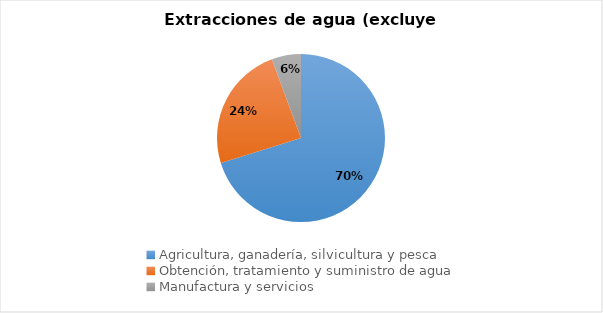
| Category | Series 1 | Series 0 |
|---|---|---|
| Agricultura, ganadería, silvicultura y pesca | 1731.022 | 1731.022 |
| Obtención, tratamiento y suministro de agua | 596.262 | 596.262 |
| Manufactura y servicios | 138.837 | 138.837 |